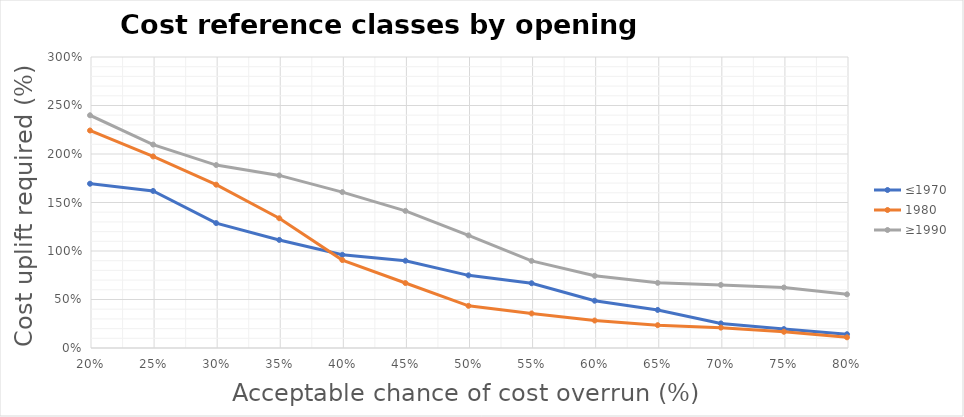
| Category | ≤1970 | 1980 | ≥1990 |
|---|---|---|---|
| 0.8 | 0.142 | 0.11 | 0.553 |
| 0.75 | 0.195 | 0.167 | 0.624 |
| 0.7 | 0.253 | 0.21 | 0.65 |
| 0.65 | 0.392 | 0.235 | 0.672 |
| 0.6 | 0.488 | 0.283 | 0.745 |
| 0.55 | 0.668 | 0.356 | 0.898 |
| 0.5 | 0.749 | 0.435 | 1.161 |
| 0.45 | 0.9 | 0.67 | 1.414 |
| 0.399999999999999 | 0.961 | 0.907 | 1.607 |
| 0.349999999999999 | 1.114 | 1.338 | 1.779 |
| 0.299999999999999 | 1.288 | 1.684 | 1.886 |
| 0.249999999999999 | 1.619 | 1.975 | 2.097 |
| 0.199999999999999 | 1.694 | 2.242 | 2.399 |